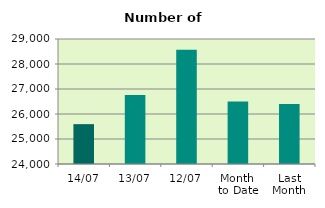
| Category | Series 0 |
|---|---|
| 14/07 | 25594 |
| 13/07 | 26760 |
| 12/07 | 28570 |
| Month 
to Date | 26501.6 |
| Last
Month | 26399.455 |